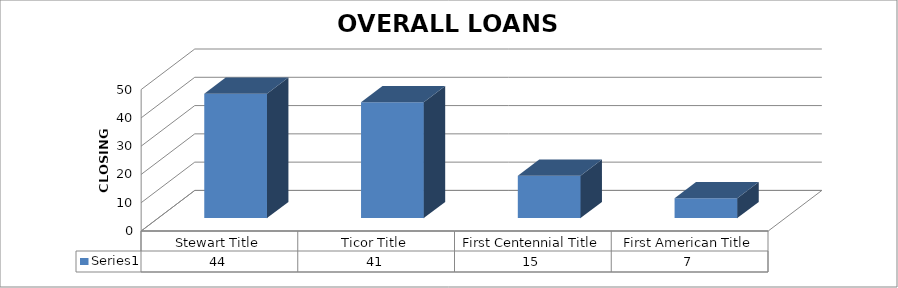
| Category | Series 0 |
|---|---|
| Stewart Title | 44 |
| Ticor Title | 41 |
| First Centennial Title | 15 |
| First American Title | 7 |